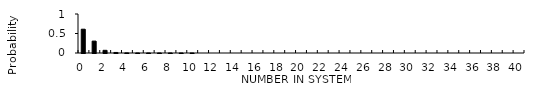
| Category | Series 0 |
|---|---|
| 0.0 | 0.61 |
| 1.0 | 0.305 |
| 2.0 | 0.069 |
| 3.0 | 0.014 |
| 4.0 | 0.002 |
| 5.0 | 0 |
| 6.0 | 0 |
| 7.0 | 0 |
| 8.0 | 0 |
| 9.0 | 0 |
| 10.0 | 0 |
| 11.0 | 0 |
| 12.0 | 0 |
| 13.0 | 0 |
| 14.0 | 0 |
| 15.0 | 0 |
| 16.0 | 0 |
| 17.0 | 0 |
| 18.0 | 0 |
| 19.0 | 0 |
| 20.0 | 0 |
| 21.0 | 0 |
| 22.0 | 0 |
| 23.0 | 0 |
| 24.0 | 0 |
| 25.0 | 0 |
| 26.0 | 0 |
| 27.0 | 0 |
| 28.0 | 0 |
| 29.0 | 0 |
| 30.0 | 0 |
| 31.0 | 0 |
| 32.0 | 0 |
| 33.0 | 0 |
| 34.0 | 0 |
| 35.0 | 0 |
| 36.0 | 0 |
| 37.0 | 0 |
| 38.0 | 0 |
| 39.0 | 0 |
| 40.0 | 0 |